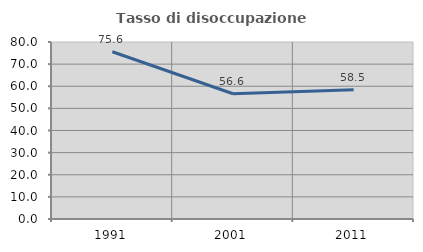
| Category | Tasso di disoccupazione giovanile  |
|---|---|
| 1991.0 | 75.591 |
| 2001.0 | 56.604 |
| 2011.0 | 58.462 |